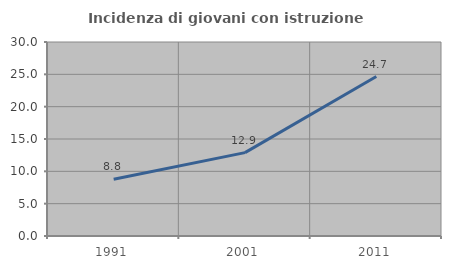
| Category | Incidenza di giovani con istruzione universitaria |
|---|---|
| 1991.0 | 8.765 |
| 2001.0 | 12.892 |
| 2011.0 | 24.653 |